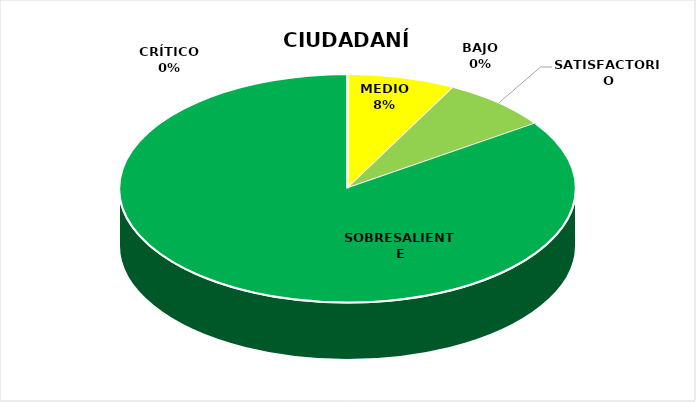
| Category | Series 0 |
|---|---|
| CRÍTICO | 0 |
| BAJO | 0 |
| MEDIO | 1 |
| SATISFACTORIO | 1 |
| SOBRESALIENTE | 11 |